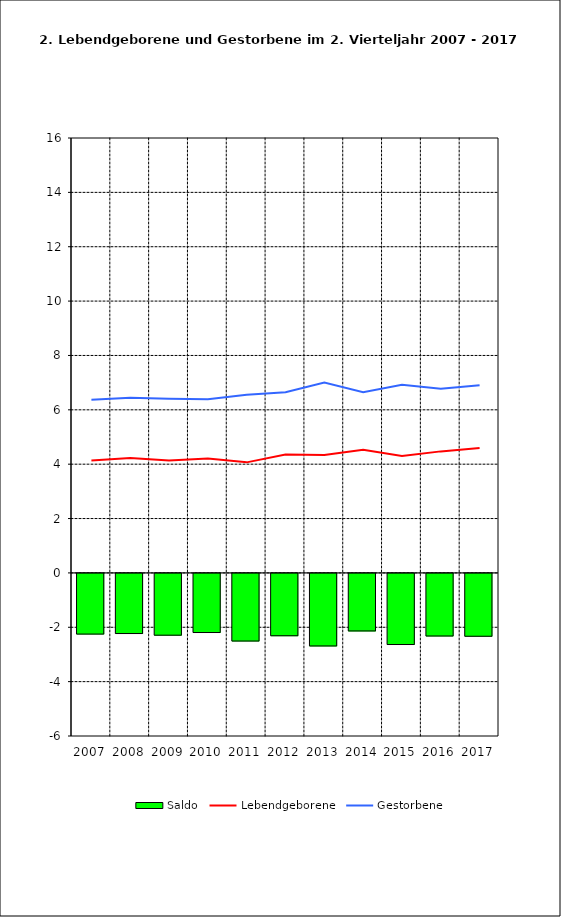
| Category | Saldo |
|---|---|
| 2005.0 | -2.232 |
| 2006.0 | -2.212 |
| 2007.0 | -2.273 |
| 2008.0 | -2.175 |
| 2009.0 | -2.488 |
| 2010.0 | -2.293 |
| 2011.0 | -2.669 |
| 2012.0 | -2.117 |
| 2013.0 | -2.616 |
| 2014.0 | -2.303 |
| 2015.0 | -2.312 |